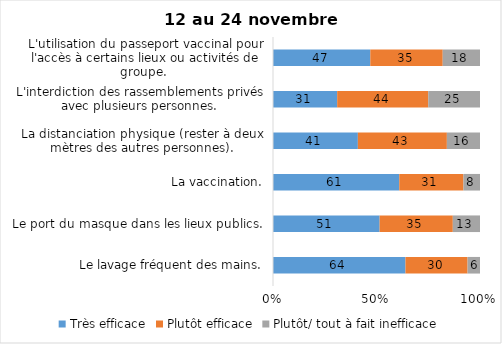
| Category | Très efficace | Plutôt efficace | Plutôt/ tout à fait inefficace |
|---|---|---|---|
| Le lavage fréquent des mains. | 64 | 30 | 6 |
| Le port du masque dans les lieux publics. | 51 | 35 | 13 |
| La vaccination. | 61 | 31 | 8 |
| La distanciation physique (rester à deux mètres des autres personnes). | 41 | 43 | 16 |
| L'interdiction des rassemblements privés avec plusieurs personnes. | 31 | 44 | 25 |
| L'utilisation du passeport vaccinal pour l'accès à certains lieux ou activités de groupe.  | 47 | 35 | 18 |